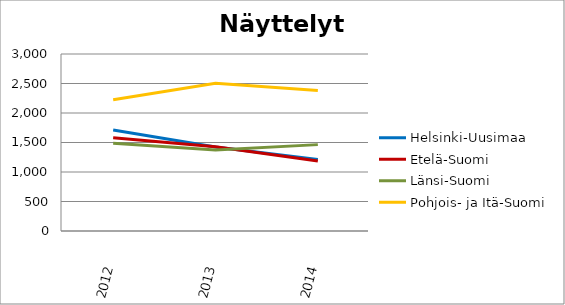
| Category | Helsinki-Uusimaa | Etelä-Suomi | Länsi-Suomi | Pohjois- ja Itä-Suomi |
|---|---|---|---|---|
| 2012.0 | 1711 | 1580 | 1487 | 2225 |
| 2013.0 | 1424 | 1429 | 1375 | 2505 |
| 2014.0 | 1213 | 1186 | 1464 | 2382 |